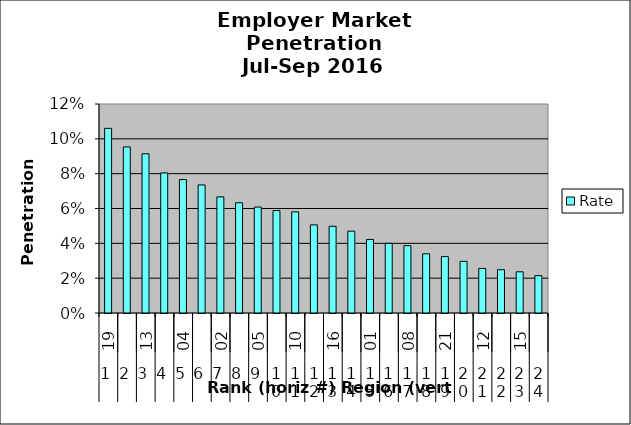
| Category | Rate |
|---|---|
| 0 | 0.106 |
| 1 | 0.095 |
| 2 | 0.091 |
| 3 | 0.08 |
| 4 | 0.077 |
| 5 | 0.074 |
| 6 | 0.067 |
| 7 | 0.063 |
| 8 | 0.061 |
| 9 | 0.059 |
| 10 | 0.058 |
| 11 | 0.051 |
| 12 | 0.05 |
| 13 | 0.047 |
| 14 | 0.042 |
| 15 | 0.04 |
| 16 | 0.039 |
| 17 | 0.034 |
| 18 | 0.032 |
| 19 | 0.03 |
| 20 | 0.026 |
| 21 | 0.025 |
| 22 | 0.024 |
| 23 | 0.021 |